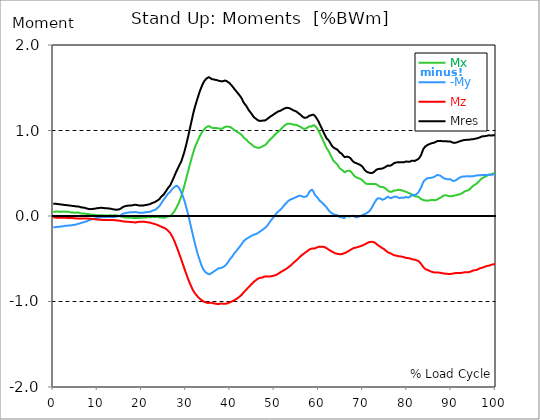
| Category |  Mx |  -My |  Mz |  Mres |
|---|---|---|---|---|
| 0.0 | 0.049 | -0.132 | -0.019 | 0.142 |
| 0.167348456675344 | 0.049 | -0.132 | -0.018 | 0.142 |
| 0.334696913350688 | 0.049 | -0.132 | -0.018 | 0.142 |
| 0.5020453700260321 | 0.052 | -0.13 | -0.019 | 0.142 |
| 0.669393826701376 | 0.053 | -0.129 | -0.019 | 0.142 |
| 0.83674228337672 | 0.054 | -0.128 | -0.019 | 0.141 |
| 1.0040907400520642 | 0.053 | -0.126 | -0.019 | 0.139 |
| 1.1621420602454444 | 0.05 | -0.128 | -0.019 | 0.139 |
| 1.3294905169207885 | 0.049 | -0.126 | -0.021 | 0.138 |
| 1.4968389735961325 | 0.048 | -0.125 | -0.021 | 0.137 |
| 1.6641874302714765 | 0.049 | -0.124 | -0.021 | 0.135 |
| 1.8315358869468206 | 0.05 | -0.123 | -0.021 | 0.134 |
| 1.9988843436221646 | 0.052 | -0.12 | -0.021 | 0.133 |
| 2.1662328002975086 | 0.052 | -0.119 | -0.021 | 0.132 |
| 2.333581256972853 | 0.05 | -0.119 | -0.021 | 0.13 |
| 2.5009297136481967 | 0.049 | -0.117 | -0.021 | 0.129 |
| 2.6682781703235405 | 0.052 | -0.115 | -0.021 | 0.129 |
| 2.8356266269988843 | 0.052 | -0.115 | -0.022 | 0.128 |
| 3.002975083674229 | 0.049 | -0.115 | -0.022 | 0.126 |
| 3.1703235403495724 | 0.048 | -0.114 | -0.022 | 0.126 |
| 3.337671997024917 | 0.049 | -0.112 | -0.022 | 0.125 |
| 3.4957233172182973 | 0.049 | -0.111 | -0.022 | 0.124 |
| 3.663071773893641 | 0.048 | -0.11 | -0.023 | 0.123 |
| 3.8304202305689854 | 0.044 | -0.11 | -0.025 | 0.121 |
| 3.997768687244329 | 0.04 | -0.11 | -0.025 | 0.12 |
| 4.165117143919673 | 0.041 | -0.107 | -0.025 | 0.119 |
| 4.332465600595017 | 0.043 | -0.106 | -0.025 | 0.117 |
| 4.499814057270361 | 0.043 | -0.105 | -0.026 | 0.116 |
| 4.667162513945706 | 0.04 | -0.103 | -0.026 | 0.116 |
| 4.834510970621049 | 0.039 | -0.103 | -0.027 | 0.115 |
| 5.001859427296393 | 0.037 | -0.102 | -0.027 | 0.114 |
| 5.169207883971737 | 0.037 | -0.099 | -0.027 | 0.112 |
| 5.336556340647081 | 0.041 | -0.095 | -0.028 | 0.111 |
| 5.503904797322425 | 0.04 | -0.093 | -0.03 | 0.11 |
| 5.671253253997769 | 0.04 | -0.09 | -0.03 | 0.111 |
| 5.82930457419115 | 0.037 | -0.089 | -0.031 | 0.11 |
| 5.996653030866494 | 0.034 | -0.086 | -0.031 | 0.106 |
| 6.164001487541838 | 0.031 | -0.083 | -0.03 | 0.103 |
| 6.331349944217181 | 0.028 | -0.08 | -0.03 | 0.101 |
| 6.498698400892526 | 0.028 | -0.076 | -0.03 | 0.099 |
| 6.66604685756787 | 0.028 | -0.075 | -0.03 | 0.099 |
| 6.833395314243213 | 0.028 | -0.074 | -0.03 | 0.099 |
| 7.000743770918558 | 0.028 | -0.071 | -0.03 | 0.097 |
| 7.168092227593902 | 0.028 | -0.068 | -0.03 | 0.094 |
| 7.335440684269246 | 0.026 | -0.066 | -0.03 | 0.092 |
| 7.50278914094459 | 0.025 | -0.062 | -0.03 | 0.089 |
| 7.6701375976199335 | 0.023 | -0.059 | -0.03 | 0.086 |
| 7.837486054295278 | 0.022 | -0.055 | -0.031 | 0.084 |
| 7.995537374488658 | 0.022 | -0.05 | -0.031 | 0.081 |
| 8.162885831164003 | 0.021 | -0.046 | -0.031 | 0.08 |
| 8.330234287839346 | 0.018 | -0.044 | -0.031 | 0.08 |
| 8.49758274451469 | 0.015 | -0.041 | -0.032 | 0.08 |
| 8.664931201190035 | 0.015 | -0.039 | -0.034 | 0.081 |
| 8.832279657865378 | 0.015 | -0.035 | -0.034 | 0.083 |
| 8.999628114540721 | 0.015 | -0.034 | -0.035 | 0.084 |
| 9.166976571216066 | 0.015 | -0.031 | -0.036 | 0.085 |
| 9.334325027891412 | 0.014 | -0.03 | -0.037 | 0.085 |
| 9.501673484566755 | 0.012 | -0.027 | -0.037 | 0.086 |
| 9.669021941242098 | 0.008 | -0.026 | -0.039 | 0.089 |
| 9.836370397917442 | 0.01 | -0.022 | -0.04 | 0.09 |
| 10.003718854592787 | 0.01 | -0.021 | -0.041 | 0.092 |
| 10.17106731126813 | 0.01 | -0.019 | -0.041 | 0.092 |
| 10.329118631461512 | 0.009 | -0.019 | -0.043 | 0.093 |
| 10.496467088136853 | 0.009 | -0.018 | -0.044 | 0.094 |
| 10.663815544812199 | 0.008 | -0.015 | -0.044 | 0.095 |
| 10.831164001487544 | 0.009 | -0.014 | -0.045 | 0.097 |
| 10.998512458162887 | 0.009 | -0.013 | -0.046 | 0.095 |
| 11.16586091483823 | 0.009 | -0.013 | -0.046 | 0.094 |
| 11.333209371513574 | 0.008 | -0.014 | -0.046 | 0.093 |
| 11.50055782818892 | 0.006 | -0.014 | -0.046 | 0.092 |
| 11.667906284864264 | 0.005 | -0.014 | -0.046 | 0.092 |
| 11.835254741539607 | 0.004 | -0.013 | -0.046 | 0.092 |
| 12.00260319821495 | 0.005 | -0.012 | -0.046 | 0.09 |
| 12.169951654890292 | 0.006 | -0.01 | -0.048 | 0.09 |
| 12.337300111565641 | 0.005 | -0.012 | -0.048 | 0.089 |
| 12.504648568240984 | 0.006 | -0.012 | -0.046 | 0.089 |
| 12.662699888434362 | 0.008 | -0.012 | -0.046 | 0.088 |
| 12.830048345109708 | 0.009 | -0.01 | -0.048 | 0.086 |
| 12.997396801785053 | 0.009 | -0.012 | -0.048 | 0.085 |
| 13.164745258460396 | 0.005 | -0.012 | -0.048 | 0.083 |
| 13.33209371513574 | 0.004 | -0.012 | -0.048 | 0.08 |
| 13.499442171811083 | 0.006 | -0.013 | -0.048 | 0.079 |
| 13.666790628486426 | 0.009 | -0.012 | -0.048 | 0.077 |
| 13.834139085161771 | 0.01 | -0.01 | -0.049 | 0.076 |
| 14.001487541837117 | 0.008 | -0.01 | -0.05 | 0.075 |
| 14.16883599851246 | 0.005 | -0.009 | -0.05 | 0.074 |
| 14.336184455187803 | 0.004 | -0.006 | -0.052 | 0.074 |
| 14.503532911863147 | 0.004 | -0.004 | -0.052 | 0.075 |
| 14.670881368538492 | 0.005 | -0.004 | -0.053 | 0.076 |
| 14.828932688731873 | 0.001 | -0.001 | -0.054 | 0.077 |
| 14.996281145407215 | -0.001 | 0.001 | -0.055 | 0.08 |
| 15.163629602082558 | -0.004 | 0.005 | -0.057 | 0.085 |
| 15.330978058757903 | -0.008 | 0.012 | -0.058 | 0.09 |
| 15.498326515433247 | -0.008 | 0.015 | -0.059 | 0.094 |
| 15.665674972108594 | -0.01 | 0.025 | -0.062 | 0.103 |
| 15.833023428783937 | -0.014 | 0.028 | -0.063 | 0.108 |
| 16.00037188545928 | -0.017 | 0.03 | -0.065 | 0.111 |
| 16.167720342134626 | -0.017 | 0.032 | -0.065 | 0.114 |
| 16.335068798809967 | -0.017 | 0.035 | -0.066 | 0.116 |
| 16.502417255485312 | -0.018 | 0.036 | -0.067 | 0.117 |
| 16.669765712160658 | -0.018 | 0.039 | -0.067 | 0.12 |
| 16.837114168836 | -0.018 | 0.04 | -0.068 | 0.12 |
| 17.004462625511344 | -0.021 | 0.04 | -0.068 | 0.121 |
| 17.16251394570472 | -0.021 | 0.043 | -0.068 | 0.123 |
| 17.32986240238007 | -0.018 | 0.044 | -0.07 | 0.124 |
| 17.497210859055414 | -0.019 | 0.044 | -0.071 | 0.124 |
| 17.664559315730756 | -0.021 | 0.043 | -0.071 | 0.124 |
| 17.8319077724061 | -0.022 | 0.043 | -0.071 | 0.125 |
| 17.999256229081443 | -0.022 | 0.044 | -0.072 | 0.126 |
| 18.166604685756788 | -0.021 | 0.045 | -0.074 | 0.128 |
| 18.333953142432133 | -0.022 | 0.046 | -0.075 | 0.13 |
| 18.501301599107478 | -0.022 | 0.048 | -0.076 | 0.132 |
| 18.668650055782823 | -0.022 | 0.046 | -0.075 | 0.13 |
| 18.835998512458165 | -0.022 | 0.044 | -0.074 | 0.129 |
| 19.00334696913351 | -0.022 | 0.043 | -0.071 | 0.128 |
| 19.170695425808855 | -0.021 | 0.04 | -0.07 | 0.125 |
| 19.338043882484197 | -0.022 | 0.037 | -0.067 | 0.123 |
| 19.496095202677576 | -0.021 | 0.037 | -0.067 | 0.123 |
| 19.66344365935292 | -0.019 | 0.037 | -0.067 | 0.121 |
| 19.830792116028263 | -0.021 | 0.037 | -0.066 | 0.121 |
| 19.998140572703612 | -0.019 | 0.037 | -0.066 | 0.123 |
| 20.165489029378953 | -0.018 | 0.037 | -0.066 | 0.123 |
| 20.3328374860543 | -0.017 | 0.039 | -0.066 | 0.123 |
| 20.500185942729644 | -0.017 | 0.041 | -0.067 | 0.124 |
| 20.667534399404985 | -0.018 | 0.043 | -0.068 | 0.126 |
| 20.83488285608033 | -0.021 | 0.043 | -0.07 | 0.126 |
| 21.002231312755672 | -0.018 | 0.044 | -0.071 | 0.129 |
| 21.16957976943102 | -0.015 | 0.045 | -0.072 | 0.132 |
| 21.336928226106362 | -0.014 | 0.046 | -0.074 | 0.133 |
| 21.504276682781704 | -0.013 | 0.046 | -0.075 | 0.135 |
| 21.67162513945705 | -0.012 | 0.048 | -0.076 | 0.137 |
| 21.82967645965043 | -0.014 | 0.049 | -0.079 | 0.139 |
| 21.997024916325774 | -0.015 | 0.052 | -0.08 | 0.142 |
| 22.16437337300112 | -0.015 | 0.057 | -0.083 | 0.147 |
| 22.33172182967646 | -0.013 | 0.061 | -0.085 | 0.151 |
| 22.499070286351806 | -0.012 | 0.065 | -0.088 | 0.155 |
| 22.666418743027148 | -0.013 | 0.067 | -0.09 | 0.157 |
| 22.833767199702496 | -0.013 | 0.07 | -0.093 | 0.161 |
| 23.00111565637784 | -0.013 | 0.072 | -0.095 | 0.164 |
| 23.168464113053183 | -0.014 | 0.077 | -0.098 | 0.17 |
| 23.335812569728528 | -0.013 | 0.084 | -0.101 | 0.175 |
| 23.50316102640387 | -0.013 | 0.09 | -0.105 | 0.181 |
| 23.670509483079215 | -0.013 | 0.099 | -0.108 | 0.186 |
| 23.83785793975456 | -0.014 | 0.105 | -0.111 | 0.19 |
| 23.995909259947936 | -0.017 | 0.116 | -0.115 | 0.199 |
| 24.163257716623285 | -0.017 | 0.129 | -0.119 | 0.209 |
| 24.330606173298627 | -0.017 | 0.145 | -0.124 | 0.223 |
| 24.49795462997397 | -0.015 | 0.156 | -0.128 | 0.231 |
| 24.665303086649313 | -0.017 | 0.169 | -0.13 | 0.237 |
| 24.83265154332466 | -0.019 | 0.182 | -0.134 | 0.248 |
| 25.0 | -0.021 | 0.192 | -0.138 | 0.255 |
| 25.167348456675345 | -0.021 | 0.206 | -0.143 | 0.268 |
| 25.334696913350694 | -0.017 | 0.218 | -0.147 | 0.279 |
| 25.502045370026035 | -0.013 | 0.231 | -0.152 | 0.293 |
| 25.669393826701377 | -0.009 | 0.244 | -0.159 | 0.307 |
| 25.836742283376722 | -0.008 | 0.254 | -0.166 | 0.319 |
| 26.004090740052067 | -0.005 | 0.265 | -0.175 | 0.333 |
| 26.17143919672741 | -0.004 | 0.272 | -0.185 | 0.343 |
| 26.329490516920792 | -0.001 | 0.277 | -0.194 | 0.352 |
| 26.49683897359613 | 0.004 | 0.288 | -0.206 | 0.368 |
| 26.66418743027148 | 0.012 | 0.301 | -0.221 | 0.386 |
| 26.831535886946828 | 0.019 | 0.312 | -0.236 | 0.404 |
| 26.998884343622166 | 0.03 | 0.323 | -0.253 | 0.425 |
| 27.166232800297514 | 0.04 | 0.333 | -0.271 | 0.444 |
| 27.333581256972852 | 0.053 | 0.338 | -0.289 | 0.463 |
| 27.5009297136482 | 0.067 | 0.346 | -0.31 | 0.484 |
| 27.668278170323543 | 0.083 | 0.35 | -0.333 | 0.505 |
| 27.835626626998888 | 0.098 | 0.351 | -0.355 | 0.523 |
| 28.002975083674233 | 0.115 | 0.35 | -0.377 | 0.541 |
| 28.170323540349575 | 0.132 | 0.342 | -0.401 | 0.56 |
| 28.33767199702492 | 0.151 | 0.334 | -0.425 | 0.578 |
| 28.50502045370026 | 0.173 | 0.321 | -0.449 | 0.596 |
| 28.663071773893645 | 0.195 | 0.306 | -0.472 | 0.613 |
| 28.830420230568986 | 0.218 | 0.285 | -0.495 | 0.628 |
| 28.99776868724433 | 0.244 | 0.263 | -0.52 | 0.649 |
| 29.165117143919673 | 0.272 | 0.246 | -0.546 | 0.677 |
| 29.33246560059502 | 0.303 | 0.225 | -0.572 | 0.703 |
| 29.499814057270367 | 0.333 | 0.199 | -0.595 | 0.73 |
| 29.66716251394571 | 0.364 | 0.174 | -0.621 | 0.76 |
| 29.834510970621054 | 0.399 | 0.145 | -0.646 | 0.794 |
| 30.00185942729639 | 0.431 | 0.11 | -0.67 | 0.826 |
| 30.169207883971744 | 0.465 | 0.079 | -0.693 | 0.862 |
| 30.33655634064708 | 0.498 | 0.046 | -0.717 | 0.899 |
| 30.50390479732243 | 0.53 | 0.012 | -0.741 | 0.935 |
| 30.671253253997772 | 0.563 | -0.023 | -0.763 | 0.974 |
| 30.829304574191156 | 0.595 | -0.062 | -0.783 | 1.014 |
| 30.996653030866494 | 0.627 | -0.101 | -0.804 | 1.054 |
| 31.164001487541842 | 0.658 | -0.138 | -0.823 | 1.093 |
| 31.331349944217187 | 0.69 | -0.175 | -0.843 | 1.132 |
| 31.498698400892525 | 0.72 | -0.213 | -0.861 | 1.17 |
| 31.666046857567874 | 0.748 | -0.249 | -0.876 | 1.208 |
| 31.833395314243212 | 0.775 | -0.284 | -0.89 | 1.241 |
| 32.00074377091856 | 0.801 | -0.32 | -0.903 | 1.274 |
| 32.1680922275939 | 0.825 | -0.355 | -0.915 | 1.303 |
| 32.33544068426925 | 0.845 | -0.387 | -0.925 | 1.332 |
| 32.50278914094459 | 0.863 | -0.419 | -0.935 | 1.36 |
| 32.670137597619934 | 0.884 | -0.449 | -0.945 | 1.387 |
| 32.83748605429528 | 0.903 | -0.477 | -0.954 | 1.414 |
| 33.004834510970625 | 0.923 | -0.503 | -0.963 | 1.44 |
| 33.162885831164004 | 0.941 | -0.529 | -0.97 | 1.466 |
| 33.33023428783935 | 0.956 | -0.555 | -0.977 | 1.489 |
| 33.497582744514695 | 0.972 | -0.577 | -0.983 | 1.511 |
| 33.664931201190036 | 0.986 | -0.596 | -0.99 | 1.532 |
| 33.83227965786538 | 0.997 | -0.614 | -0.996 | 1.55 |
| 33.99962811454073 | 1.009 | -0.63 | -1.001 | 1.566 |
| 34.16697657121607 | 1.019 | -0.641 | -1.004 | 1.579 |
| 34.33432502789141 | 1.027 | -0.654 | -1.008 | 1.591 |
| 34.50167348456676 | 1.035 | -0.663 | -1.01 | 1.601 |
| 34.6690219412421 | 1.04 | -0.667 | -1.013 | 1.608 |
| 34.83637039791744 | 1.046 | -0.671 | -1.017 | 1.615 |
| 35.00371885459279 | 1.05 | -0.677 | -1.018 | 1.621 |
| 35.17106731126814 | 1.052 | -0.68 | -1.018 | 1.623 |
| 35.338415767943474 | 1.049 | -0.683 | -1.014 | 1.621 |
| 35.49646708813686 | 1.043 | -0.677 | -1.013 | 1.613 |
| 35.6638155448122 | 1.036 | -0.67 | -1.014 | 1.605 |
| 35.831164001487544 | 1.03 | -0.661 | -1.018 | 1.6 |
| 35.998512458162885 | 1.03 | -0.661 | -1.019 | 1.601 |
| 36.165860914838234 | 1.028 | -0.655 | -1.021 | 1.599 |
| 36.333209371513576 | 1.03 | -0.646 | -1.022 | 1.596 |
| 36.50055782818892 | 1.03 | -0.64 | -1.023 | 1.594 |
| 36.667906284864266 | 1.03 | -0.636 | -1.026 | 1.594 |
| 36.83525474153961 | 1.028 | -0.631 | -1.027 | 1.591 |
| 37.002603198214956 | 1.027 | -0.625 | -1.028 | 1.588 |
| 37.1699516548903 | 1.026 | -0.617 | -1.031 | 1.586 |
| 37.337300111565646 | 1.023 | -0.612 | -1.031 | 1.582 |
| 37.50464856824098 | 1.021 | -0.612 | -1.028 | 1.581 |
| 37.66269988843437 | 1.022 | -0.61 | -1.026 | 1.579 |
| 37.83004834510971 | 1.021 | -0.609 | -1.025 | 1.577 |
| 37.99739680178505 | 1.019 | -0.605 | -1.023 | 1.574 |
| 38.16474525846039 | 1.022 | -0.603 | -1.025 | 1.574 |
| 38.33209371513574 | 1.027 | -0.6 | -1.026 | 1.577 |
| 38.49944217181109 | 1.032 | -0.594 | -1.026 | 1.579 |
| 38.666790628486424 | 1.039 | -0.587 | -1.027 | 1.583 |
| 38.83413908516178 | 1.043 | -0.581 | -1.027 | 1.585 |
| 39.001487541837115 | 1.044 | -0.573 | -1.026 | 1.581 |
| 39.16883599851246 | 1.046 | -0.563 | -1.025 | 1.578 |
| 39.336184455187805 | 1.046 | -0.551 | -1.022 | 1.573 |
| 39.503532911863154 | 1.044 | -0.539 | -1.019 | 1.566 |
| 39.670881368538495 | 1.044 | -0.526 | -1.015 | 1.56 |
| 39.83822982521384 | 1.044 | -0.512 | -1.012 | 1.554 |
| 39.996281145407224 | 1.04 | -0.499 | -1.008 | 1.543 |
| 40.163629602082565 | 1.035 | -0.49 | -1.004 | 1.535 |
| 40.33097805875791 | 1.03 | -0.481 | -1 | 1.528 |
| 40.498326515433256 | 1.021 | -0.47 | -0.997 | 1.515 |
| 40.6656749721086 | 1.015 | -0.457 | -0.992 | 1.505 |
| 40.83302342878393 | 1.009 | -0.444 | -0.987 | 1.493 |
| 41.00037188545929 | 1.003 | -0.431 | -0.982 | 1.48 |
| 41.16772034213463 | 0.997 | -0.421 | -0.978 | 1.471 |
| 41.33506879880997 | 0.991 | -0.412 | -0.972 | 1.461 |
| 41.50241725548531 | 0.986 | -0.401 | -0.965 | 1.45 |
| 41.66976571216066 | 0.979 | -0.388 | -0.96 | 1.439 |
| 41.837114168836 | 0.973 | -0.379 | -0.954 | 1.428 |
| 42.004462625511344 | 0.97 | -0.368 | -0.947 | 1.418 |
| 42.17181108218669 | 0.964 | -0.357 | -0.939 | 1.406 |
| 42.32986240238007 | 0.959 | -0.346 | -0.933 | 1.395 |
| 42.497210859055414 | 0.951 | -0.334 | -0.925 | 1.382 |
| 42.66455931573076 | 0.942 | -0.323 | -0.916 | 1.366 |
| 42.831907772406105 | 0.93 | -0.308 | -0.906 | 1.347 |
| 42.999256229081446 | 0.92 | -0.295 | -0.895 | 1.33 |
| 43.16660468575679 | 0.912 | -0.286 | -0.885 | 1.316 |
| 43.33395314243214 | 0.905 | -0.28 | -0.876 | 1.305 |
| 43.50130159910748 | 0.898 | -0.275 | -0.868 | 1.295 |
| 43.66865005578282 | 0.892 | -0.267 | -0.859 | 1.283 |
| 43.83599851245817 | 0.881 | -0.263 | -0.849 | 1.268 |
| 44.00334696913351 | 0.871 | -0.257 | -0.839 | 1.253 |
| 44.17069542580886 | 0.863 | -0.252 | -0.83 | 1.24 |
| 44.3380438824842 | 0.855 | -0.246 | -0.822 | 1.228 |
| 44.49609520267758 | 0.85 | -0.241 | -0.813 | 1.217 |
| 44.66344365935292 | 0.844 | -0.236 | -0.804 | 1.206 |
| 44.83079211602827 | 0.837 | -0.23 | -0.796 | 1.195 |
| 44.99814057270361 | 0.828 | -0.226 | -0.787 | 1.181 |
| 45.16548902937895 | 0.819 | -0.223 | -0.777 | 1.168 |
| 45.332837486054295 | 0.813 | -0.219 | -0.769 | 1.157 |
| 45.500185942729644 | 0.808 | -0.215 | -0.763 | 1.148 |
| 45.66753439940499 | 0.806 | -0.213 | -0.756 | 1.143 |
| 45.83488285608033 | 0.804 | -0.21 | -0.748 | 1.137 |
| 46.00223131275568 | 0.801 | -0.206 | -0.743 | 1.13 |
| 46.16957976943102 | 0.797 | -0.201 | -0.737 | 1.123 |
| 46.336928226106366 | 0.796 | -0.196 | -0.732 | 1.117 |
| 46.50427668278171 | 0.796 | -0.19 | -0.728 | 1.114 |
| 46.671625139457056 | 0.799 | -0.183 | -0.724 | 1.112 |
| 46.829676459650436 | 0.803 | -0.178 | -0.723 | 1.112 |
| 46.99702491632577 | 0.806 | -0.172 | -0.721 | 1.114 |
| 47.16437337300112 | 0.812 | -0.166 | -0.72 | 1.115 |
| 47.33172182967646 | 0.817 | -0.161 | -0.717 | 1.116 |
| 47.49907028635181 | 0.821 | -0.154 | -0.715 | 1.116 |
| 47.66641874302716 | 0.825 | -0.146 | -0.71 | 1.116 |
| 47.83376719970249 | 0.828 | -0.141 | -0.707 | 1.117 |
| 48.001115656377834 | 0.834 | -0.133 | -0.706 | 1.12 |
| 48.16846411305319 | 0.844 | -0.125 | -0.706 | 1.126 |
| 48.33581256972853 | 0.854 | -0.116 | -0.707 | 1.133 |
| 48.50316102640387 | 0.866 | -0.103 | -0.708 | 1.141 |
| 48.67050948307921 | 0.876 | -0.09 | -0.708 | 1.147 |
| 48.837857939754564 | 0.885 | -0.077 | -0.707 | 1.154 |
| 49.005206396429905 | 0.894 | -0.065 | -0.707 | 1.159 |
| 49.163257716623285 | 0.903 | -0.053 | -0.706 | 1.166 |
| 49.33060617329863 | 0.911 | -0.044 | -0.703 | 1.172 |
| 49.49795462997397 | 0.919 | -0.034 | -0.702 | 1.177 |
| 49.66530308664932 | 0.928 | -0.022 | -0.699 | 1.183 |
| 49.832651543324666 | 0.937 | -0.012 | -0.697 | 1.19 |
| 50.0 | 0.946 | 0 | -0.695 | 1.195 |
| 50.16734845667534 | 0.955 | 0.012 | -0.693 | 1.201 |
| 50.33469691335069 | 0.964 | 0.023 | -0.69 | 1.208 |
| 50.50204537002604 | 0.97 | 0.035 | -0.686 | 1.212 |
| 50.66939382670139 | 0.978 | 0.044 | -0.681 | 1.218 |
| 50.836742283376715 | 0.986 | 0.053 | -0.676 | 1.223 |
| 51.00409074005207 | 0.994 | 0.061 | -0.67 | 1.225 |
| 51.17143919672741 | 1 | 0.067 | -0.663 | 1.227 |
| 51.32949051692079 | 1.008 | 0.074 | -0.658 | 1.231 |
| 51.496838973596134 | 1.018 | 0.081 | -0.653 | 1.236 |
| 51.66418743027148 | 1.027 | 0.092 | -0.648 | 1.241 |
| 51.831535886946824 | 1.036 | 0.101 | -0.644 | 1.246 |
| 51.99888434362217 | 1.045 | 0.112 | -0.639 | 1.252 |
| 52.16623280029752 | 1.053 | 0.124 | -0.634 | 1.255 |
| 52.33358125697285 | 1.061 | 0.134 | -0.628 | 1.259 |
| 52.5009297136482 | 1.067 | 0.143 | -0.622 | 1.262 |
| 52.668278170323546 | 1.072 | 0.151 | -0.617 | 1.265 |
| 52.835626626998895 | 1.076 | 0.161 | -0.61 | 1.266 |
| 53.00297508367424 | 1.079 | 0.17 | -0.605 | 1.265 |
| 53.17032354034958 | 1.079 | 0.177 | -0.599 | 1.263 |
| 53.33767199702492 | 1.08 | 0.183 | -0.592 | 1.261 |
| 53.50502045370027 | 1.079 | 0.19 | -0.586 | 1.258 |
| 53.663071773893655 | 1.077 | 0.195 | -0.578 | 1.254 |
| 53.83042023056899 | 1.076 | 0.199 | -0.57 | 1.249 |
| 53.99776868724433 | 1.072 | 0.2 | -0.563 | 1.244 |
| 54.16511714391967 | 1.071 | 0.204 | -0.555 | 1.239 |
| 54.33246560059503 | 1.068 | 0.206 | -0.546 | 1.235 |
| 54.49981405727037 | 1.068 | 0.213 | -0.538 | 1.231 |
| 54.667162513945705 | 1.068 | 0.215 | -0.53 | 1.227 |
| 54.834510970621054 | 1.068 | 0.221 | -0.524 | 1.225 |
| 55.0018594272964 | 1.066 | 0.223 | -0.516 | 1.219 |
| 55.169207883971744 | 1.061 | 0.227 | -0.507 | 1.213 |
| 55.336556340647086 | 1.054 | 0.232 | -0.498 | 1.205 |
| 55.50390479732243 | 1.052 | 0.235 | -0.49 | 1.199 |
| 55.671253253997776 | 1.048 | 0.237 | -0.483 | 1.192 |
| 55.83860171067312 | 1.044 | 0.237 | -0.474 | 1.186 |
| 55.9966530308665 | 1.04 | 0.235 | -0.466 | 1.179 |
| 56.16400148754184 | 1.032 | 0.232 | -0.458 | 1.17 |
| 56.33134994421718 | 1.026 | 0.227 | -0.452 | 1.16 |
| 56.498698400892536 | 1.022 | 0.225 | -0.444 | 1.155 |
| 56.66604685756788 | 1.019 | 0.223 | -0.439 | 1.151 |
| 56.83339531424321 | 1.019 | 0.225 | -0.432 | 1.148 |
| 57.00074377091856 | 1.022 | 0.225 | -0.426 | 1.15 |
| 57.16809222759391 | 1.026 | 0.226 | -0.421 | 1.151 |
| 57.33544068426925 | 1.03 | 0.232 | -0.414 | 1.152 |
| 57.5027891409446 | 1.035 | 0.244 | -0.408 | 1.156 |
| 57.670137597619934 | 1.043 | 0.262 | -0.401 | 1.164 |
| 57.83748605429528 | 1.05 | 0.279 | -0.396 | 1.173 |
| 58.004834510970625 | 1.048 | 0.289 | -0.39 | 1.173 |
| 58.16288583116401 | 1.049 | 0.299 | -0.386 | 1.175 |
| 58.330234287839346 | 1.045 | 0.305 | -0.382 | 1.173 |
| 58.497582744514695 | 1.055 | 0.307 | -0.382 | 1.183 |
| 58.66493120119004 | 1.059 | 0.299 | -0.379 | 1.186 |
| 58.832279657865385 | 1.063 | 0.284 | -0.378 | 1.183 |
| 58.999628114540734 | 1.061 | 0.263 | -0.379 | 1.178 |
| 59.16697657121607 | 1.054 | 0.245 | -0.378 | 1.169 |
| 59.33432502789142 | 1.045 | 0.237 | -0.374 | 1.157 |
| 59.50167348456676 | 1.035 | 0.227 | -0.37 | 1.145 |
| 59.66902194124211 | 1.022 | 0.217 | -0.366 | 1.13 |
| 59.83637039791745 | 1.009 | 0.208 | -0.361 | 1.116 |
| 60.00371885459278 | 0.994 | 0.196 | -0.36 | 1.099 |
| 60.17106731126813 | 0.975 | 0.183 | -0.36 | 1.081 |
| 60.33841576794349 | 0.956 | 0.174 | -0.359 | 1.062 |
| 60.49646708813685 | 0.938 | 0.166 | -0.357 | 1.044 |
| 60.6638155448122 | 0.92 | 0.159 | -0.359 | 1.027 |
| 60.831164001487544 | 0.902 | 0.152 | -0.359 | 1.009 |
| 60.99851245816289 | 0.883 | 0.143 | -0.36 | 0.99 |
| 61.16586091483824 | 0.863 | 0.134 | -0.361 | 0.972 |
| 61.333209371513576 | 0.844 | 0.126 | -0.365 | 0.954 |
| 61.50055782818892 | 0.825 | 0.117 | -0.369 | 0.937 |
| 61.667906284864266 | 0.804 | 0.107 | -0.373 | 0.917 |
| 61.835254741539615 | 0.788 | 0.097 | -0.378 | 0.905 |
| 62.002603198214956 | 0.777 | 0.084 | -0.385 | 0.898 |
| 62.16995165489029 | 0.765 | 0.071 | -0.392 | 0.89 |
| 62.33730011156564 | 0.75 | 0.063 | -0.396 | 0.877 |
| 62.504648568240995 | 0.732 | 0.052 | -0.403 | 0.865 |
| 62.67199702491633 | 0.712 | 0.044 | -0.406 | 0.849 |
| 62.83004834510971 | 0.694 | 0.036 | -0.412 | 0.834 |
| 62.99739680178505 | 0.677 | 0.031 | -0.417 | 0.822 |
| 63.1647452584604 | 0.661 | 0.026 | -0.421 | 0.809 |
| 63.33209371513575 | 0.646 | 0.022 | -0.426 | 0.801 |
| 63.4994421718111 | 0.637 | 0.018 | -0.43 | 0.796 |
| 63.666790628486424 | 0.628 | 0.014 | -0.435 | 0.79 |
| 63.83413908516177 | 0.621 | 0.013 | -0.437 | 0.786 |
| 64.00148754183712 | 0.613 | 0.012 | -0.44 | 0.782 |
| 64.16883599851248 | 0.605 | 0.01 | -0.441 | 0.778 |
| 64.3361844551878 | 0.594 | 0.005 | -0.444 | 0.77 |
| 64.50353291186315 | 0.577 | -0.003 | -0.445 | 0.759 |
| 64.6708813685385 | 0.563 | -0.009 | -0.446 | 0.747 |
| 64.83822982521384 | 0.552 | -0.014 | -0.448 | 0.739 |
| 65.00557828188919 | 0.546 | -0.014 | -0.446 | 0.733 |
| 65.16362960208257 | 0.546 | -0.01 | -0.446 | 0.73 |
| 65.3309780587579 | 0.538 | -0.013 | -0.444 | 0.721 |
| 65.49832651543326 | 0.528 | -0.022 | -0.44 | 0.708 |
| 65.6656749721086 | 0.519 | -0.027 | -0.437 | 0.697 |
| 65.83302342878395 | 0.512 | -0.025 | -0.434 | 0.689 |
| 66.00037188545929 | 0.512 | -0.013 | -0.432 | 0.688 |
| 66.16772034213463 | 0.52 | 0.001 | -0.427 | 0.692 |
| 66.33506879880998 | 0.526 | 0.005 | -0.422 | 0.694 |
| 66.50241725548531 | 0.532 | 0 | -0.417 | 0.694 |
| 66.66976571216065 | 0.528 | -0.003 | -0.413 | 0.689 |
| 66.83711416883601 | 0.53 | -0.008 | -0.408 | 0.688 |
| 67.00446262551135 | 0.529 | -0.006 | -0.403 | 0.684 |
| 67.1718110821867 | 0.524 | -0.003 | -0.397 | 0.676 |
| 67.32986240238007 | 0.515 | 0.001 | -0.391 | 0.666 |
| 67.49721085905541 | 0.505 | 0.003 | -0.385 | 0.654 |
| 67.66455931573076 | 0.494 | 0.004 | -0.381 | 0.644 |
| 67.83190777240611 | 0.483 | 0.003 | -0.377 | 0.635 |
| 67.99925622908145 | 0.472 | -0.003 | -0.374 | 0.628 |
| 68.16660468575678 | 0.465 | -0.009 | -0.372 | 0.623 |
| 68.33395314243214 | 0.457 | -0.014 | -0.37 | 0.621 |
| 68.50130159910749 | 0.452 | -0.017 | -0.368 | 0.618 |
| 68.66865005578282 | 0.448 | -0.015 | -0.365 | 0.614 |
| 68.83599851245816 | 0.444 | -0.012 | -0.363 | 0.61 |
| 69.00334696913352 | 0.441 | -0.008 | -0.36 | 0.606 |
| 69.17069542580886 | 0.439 | -0.005 | -0.357 | 0.603 |
| 69.3380438824842 | 0.436 | -0.003 | -0.355 | 0.6 |
| 69.50539233915956 | 0.431 | 0 | -0.352 | 0.594 |
| 69.66344365935292 | 0.426 | 0.005 | -0.35 | 0.586 |
| 69.83079211602826 | 0.421 | 0.01 | -0.346 | 0.579 |
| 69.99814057270362 | 0.412 | 0.013 | -0.342 | 0.568 |
| 70.16548902937896 | 0.403 | 0.017 | -0.338 | 0.556 |
| 70.33283748605429 | 0.392 | 0.019 | -0.333 | 0.542 |
| 70.50018594272964 | 0.386 | 0.025 | -0.329 | 0.533 |
| 70.667534399405 | 0.379 | 0.027 | -0.325 | 0.525 |
| 70.83488285608033 | 0.377 | 0.034 | -0.319 | 0.517 |
| 71.00223131275568 | 0.374 | 0.04 | -0.315 | 0.514 |
| 71.16957976943102 | 0.374 | 0.046 | -0.311 | 0.511 |
| 71.33692822610637 | 0.374 | 0.053 | -0.307 | 0.508 |
| 71.50427668278171 | 0.374 | 0.059 | -0.306 | 0.506 |
| 71.67162513945706 | 0.374 | 0.07 | -0.303 | 0.503 |
| 71.8389735961324 | 0.374 | 0.083 | -0.302 | 0.501 |
| 71.99702491632577 | 0.373 | 0.098 | -0.302 | 0.502 |
| 72.16437337300113 | 0.373 | 0.112 | -0.303 | 0.503 |
| 72.33172182967647 | 0.373 | 0.129 | -0.305 | 0.51 |
| 72.49907028635181 | 0.374 | 0.146 | -0.307 | 0.516 |
| 72.66641874302715 | 0.375 | 0.16 | -0.311 | 0.523 |
| 72.8337671997025 | 0.374 | 0.174 | -0.316 | 0.53 |
| 73.00111565637783 | 0.372 | 0.188 | -0.324 | 0.539 |
| 73.16846411305319 | 0.366 | 0.199 | -0.332 | 0.546 |
| 73.33581256972853 | 0.36 | 0.205 | -0.339 | 0.548 |
| 73.50316102640387 | 0.354 | 0.204 | -0.347 | 0.55 |
| 73.67050948307921 | 0.348 | 0.208 | -0.351 | 0.551 |
| 73.83785793975457 | 0.343 | 0.206 | -0.356 | 0.551 |
| 74.00520639642991 | 0.339 | 0.203 | -0.363 | 0.552 |
| 74.16325771662328 | 0.338 | 0.197 | -0.369 | 0.554 |
| 74.33060617329863 | 0.338 | 0.191 | -0.374 | 0.555 |
| 74.49795462997398 | 0.338 | 0.188 | -0.379 | 0.556 |
| 74.66530308664932 | 0.335 | 0.195 | -0.383 | 0.561 |
| 74.83265154332466 | 0.332 | 0.197 | -0.39 | 0.565 |
| 75.00000000000001 | 0.326 | 0.203 | -0.397 | 0.57 |
| 75.16734845667534 | 0.32 | 0.208 | -0.404 | 0.574 |
| 75.3346969133507 | 0.31 | 0.217 | -0.413 | 0.582 |
| 75.50204537002605 | 0.302 | 0.222 | -0.422 | 0.588 |
| 75.66939382670138 | 0.295 | 0.227 | -0.426 | 0.591 |
| 75.83674228337672 | 0.289 | 0.222 | -0.43 | 0.59 |
| 76.00409074005208 | 0.285 | 0.213 | -0.432 | 0.587 |
| 76.17143919672742 | 0.284 | 0.206 | -0.435 | 0.586 |
| 76.33878765340276 | 0.284 | 0.209 | -0.439 | 0.592 |
| 76.49683897359614 | 0.284 | 0.214 | -0.444 | 0.597 |
| 76.66418743027148 | 0.286 | 0.217 | -0.449 | 0.603 |
| 76.83153588694682 | 0.292 | 0.221 | -0.454 | 0.612 |
| 76.99888434362218 | 0.298 | 0.225 | -0.459 | 0.618 |
| 77.16623280029752 | 0.299 | 0.223 | -0.461 | 0.619 |
| 77.33358125697285 | 0.298 | 0.226 | -0.461 | 0.623 |
| 77.5009297136482 | 0.299 | 0.227 | -0.463 | 0.625 |
| 77.66827817032356 | 0.302 | 0.226 | -0.466 | 0.627 |
| 77.83562662699889 | 0.306 | 0.221 | -0.468 | 0.628 |
| 78.00297508367423 | 0.307 | 0.214 | -0.47 | 0.628 |
| 78.17032354034959 | 0.306 | 0.21 | -0.47 | 0.627 |
| 78.33767199702493 | 0.305 | 0.209 | -0.471 | 0.627 |
| 78.50502045370027 | 0.302 | 0.213 | -0.472 | 0.627 |
| 78.67236891037561 | 0.302 | 0.215 | -0.475 | 0.628 |
| 78.83042023056899 | 0.299 | 0.215 | -0.476 | 0.63 |
| 78.99776868724433 | 0.295 | 0.213 | -0.477 | 0.628 |
| 79.16511714391969 | 0.29 | 0.213 | -0.479 | 0.627 |
| 79.33246560059503 | 0.289 | 0.215 | -0.483 | 0.63 |
| 79.49981405727036 | 0.286 | 0.219 | -0.486 | 0.634 |
| 79.66716251394571 | 0.284 | 0.222 | -0.489 | 0.636 |
| 79.83451097062107 | 0.281 | 0.221 | -0.49 | 0.636 |
| 80.00185942729641 | 0.277 | 0.218 | -0.492 | 0.636 |
| 80.16920788397174 | 0.274 | 0.215 | -0.492 | 0.634 |
| 80.33655634064709 | 0.27 | 0.217 | -0.493 | 0.634 |
| 80.50390479732243 | 0.265 | 0.222 | -0.497 | 0.636 |
| 80.67125325399778 | 0.262 | 0.227 | -0.498 | 0.637 |
| 80.83860171067312 | 0.259 | 0.235 | -0.501 | 0.643 |
| 80.99665303086651 | 0.254 | 0.241 | -0.503 | 0.645 |
| 81.16400148754184 | 0.248 | 0.244 | -0.506 | 0.645 |
| 81.3313499442172 | 0.24 | 0.249 | -0.508 | 0.646 |
| 81.49869840089255 | 0.236 | 0.245 | -0.508 | 0.645 |
| 81.66604685756786 | 0.232 | 0.243 | -0.51 | 0.644 |
| 81.83339531424322 | 0.23 | 0.245 | -0.512 | 0.648 |
| 82.00074377091858 | 0.228 | 0.252 | -0.516 | 0.653 |
| 82.16809222759392 | 0.227 | 0.259 | -0.52 | 0.657 |
| 82.33544068426926 | 0.227 | 0.266 | -0.521 | 0.661 |
| 82.50278914094459 | 0.225 | 0.275 | -0.525 | 0.666 |
| 82.67013759761994 | 0.219 | 0.288 | -0.532 | 0.674 |
| 82.83748605429528 | 0.213 | 0.302 | -0.539 | 0.685 |
| 83.00483451097062 | 0.204 | 0.32 | -0.551 | 0.699 |
| 83.17218296764597 | 0.199 | 0.337 | -0.561 | 0.716 |
| 83.33023428783935 | 0.194 | 0.359 | -0.574 | 0.739 |
| 83.4975827445147 | 0.19 | 0.379 | -0.587 | 0.763 |
| 83.66493120119004 | 0.187 | 0.399 | -0.599 | 0.783 |
| 83.83227965786537 | 0.186 | 0.412 | -0.608 | 0.797 |
| 83.99962811454073 | 0.182 | 0.421 | -0.615 | 0.808 |
| 84.16697657121607 | 0.179 | 0.427 | -0.623 | 0.815 |
| 84.33432502789142 | 0.179 | 0.434 | -0.626 | 0.821 |
| 84.50167348456677 | 0.181 | 0.44 | -0.628 | 0.828 |
| 84.6690219412421 | 0.182 | 0.444 | -0.632 | 0.834 |
| 84.83637039791745 | 0.182 | 0.445 | -0.636 | 0.836 |
| 85.0037188545928 | 0.182 | 0.445 | -0.64 | 0.839 |
| 85.17106731126813 | 0.183 | 0.445 | -0.645 | 0.844 |
| 85.33841576794349 | 0.186 | 0.446 | -0.649 | 0.846 |
| 85.50576422461883 | 0.188 | 0.448 | -0.652 | 0.85 |
| 85.66381554481221 | 0.188 | 0.449 | -0.654 | 0.852 |
| 85.83116400148755 | 0.188 | 0.452 | -0.657 | 0.854 |
| 85.99851245816289 | 0.186 | 0.457 | -0.659 | 0.858 |
| 86.16586091483823 | 0.183 | 0.458 | -0.661 | 0.859 |
| 86.33320937151358 | 0.185 | 0.465 | -0.661 | 0.863 |
| 86.50055782818893 | 0.187 | 0.471 | -0.662 | 0.868 |
| 86.66790628486427 | 0.19 | 0.476 | -0.663 | 0.872 |
| 86.83525474153961 | 0.194 | 0.48 | -0.662 | 0.876 |
| 87.00260319821496 | 0.2 | 0.48 | -0.662 | 0.877 |
| 87.16995165489031 | 0.205 | 0.476 | -0.662 | 0.877 |
| 87.33730011156564 | 0.209 | 0.474 | -0.663 | 0.876 |
| 87.504648568241 | 0.21 | 0.472 | -0.665 | 0.879 |
| 87.67199702491634 | 0.218 | 0.466 | -0.667 | 0.877 |
| 87.83004834510972 | 0.227 | 0.458 | -0.668 | 0.876 |
| 87.99739680178506 | 0.232 | 0.452 | -0.67 | 0.876 |
| 88.1647452584604 | 0.237 | 0.445 | -0.671 | 0.875 |
| 88.33209371513574 | 0.24 | 0.441 | -0.674 | 0.875 |
| 88.49944217181108 | 0.241 | 0.437 | -0.674 | 0.875 |
| 88.66679062848644 | 0.243 | 0.436 | -0.675 | 0.875 |
| 88.83413908516178 | 0.243 | 0.434 | -0.676 | 0.875 |
| 89.00148754183712 | 0.239 | 0.431 | -0.676 | 0.874 |
| 89.16883599851246 | 0.236 | 0.428 | -0.676 | 0.872 |
| 89.33618445518782 | 0.234 | 0.427 | -0.677 | 0.871 |
| 89.50353291186315 | 0.232 | 0.428 | -0.679 | 0.871 |
| 89.6708813685385 | 0.231 | 0.428 | -0.679 | 0.871 |
| 89.83822982521386 | 0.231 | 0.428 | -0.679 | 0.871 |
| 90.00557828188919 | 0.231 | 0.426 | -0.679 | 0.87 |
| 90.16362960208257 | 0.232 | 0.414 | -0.675 | 0.861 |
| 90.3309780587579 | 0.235 | 0.408 | -0.672 | 0.857 |
| 90.49832651543326 | 0.236 | 0.41 | -0.671 | 0.857 |
| 90.66567497210859 | 0.237 | 0.413 | -0.67 | 0.858 |
| 90.83302342878395 | 0.24 | 0.414 | -0.668 | 0.857 |
| 91.00037188545929 | 0.243 | 0.417 | -0.667 | 0.858 |
| 91.16772034213463 | 0.245 | 0.423 | -0.667 | 0.859 |
| 91.33506879880998 | 0.249 | 0.432 | -0.667 | 0.865 |
| 91.50241725548533 | 0.25 | 0.437 | -0.666 | 0.867 |
| 91.66976571216065 | 0.25 | 0.441 | -0.666 | 0.868 |
| 91.83711416883601 | 0.253 | 0.446 | -0.666 | 0.872 |
| 92.00446262551137 | 0.257 | 0.452 | -0.666 | 0.875 |
| 92.1718110821867 | 0.261 | 0.457 | -0.666 | 0.879 |
| 92.33915953886203 | 0.265 | 0.459 | -0.665 | 0.881 |
| 92.49721085905541 | 0.27 | 0.462 | -0.663 | 0.884 |
| 92.66455931573077 | 0.276 | 0.463 | -0.662 | 0.886 |
| 92.83190777240611 | 0.283 | 0.463 | -0.659 | 0.888 |
| 92.99925622908145 | 0.288 | 0.463 | -0.658 | 0.889 |
| 93.1666046857568 | 0.29 | 0.463 | -0.658 | 0.889 |
| 93.33395314243214 | 0.294 | 0.465 | -0.658 | 0.89 |
| 93.50130159910749 | 0.297 | 0.465 | -0.658 | 0.892 |
| 93.66865005578283 | 0.298 | 0.465 | -0.658 | 0.892 |
| 93.83599851245818 | 0.299 | 0.465 | -0.657 | 0.892 |
| 94.00334696913353 | 0.307 | 0.463 | -0.655 | 0.892 |
| 94.17069542580886 | 0.319 | 0.463 | -0.653 | 0.894 |
| 94.3380438824842 | 0.324 | 0.465 | -0.652 | 0.895 |
| 94.50539233915954 | 0.332 | 0.465 | -0.648 | 0.897 |
| 94.66344365935292 | 0.341 | 0.465 | -0.643 | 0.897 |
| 94.83079211602828 | 0.348 | 0.465 | -0.639 | 0.897 |
| 94.99814057270362 | 0.357 | 0.466 | -0.635 | 0.899 |
| 95.16548902937897 | 0.363 | 0.468 | -0.635 | 0.902 |
| 95.33283748605432 | 0.365 | 0.47 | -0.635 | 0.902 |
| 95.50018594272963 | 0.373 | 0.472 | -0.632 | 0.906 |
| 95.66753439940499 | 0.378 | 0.475 | -0.632 | 0.907 |
| 95.83488285608034 | 0.385 | 0.475 | -0.628 | 0.908 |
| 96.00223131275567 | 0.395 | 0.475 | -0.622 | 0.911 |
| 96.16957976943102 | 0.404 | 0.476 | -0.618 | 0.915 |
| 96.33692822610638 | 0.412 | 0.477 | -0.614 | 0.917 |
| 96.50427668278171 | 0.422 | 0.476 | -0.61 | 0.92 |
| 96.67162513945706 | 0.431 | 0.476 | -0.609 | 0.925 |
| 96.8389735961324 | 0.439 | 0.479 | -0.608 | 0.929 |
| 96.99702491632577 | 0.444 | 0.48 | -0.605 | 0.932 |
| 97.16437337300111 | 0.448 | 0.48 | -0.601 | 0.933 |
| 97.33172182967647 | 0.452 | 0.48 | -0.599 | 0.933 |
| 97.49907028635181 | 0.455 | 0.479 | -0.595 | 0.933 |
| 97.66641874302715 | 0.461 | 0.479 | -0.591 | 0.934 |
| 97.8337671997025 | 0.466 | 0.48 | -0.588 | 0.937 |
| 98.00111565637785 | 0.471 | 0.479 | -0.586 | 0.938 |
| 98.16846411305319 | 0.475 | 0.477 | -0.583 | 0.939 |
| 98.33581256972855 | 0.48 | 0.48 | -0.582 | 0.942 |
| 98.50316102640389 | 0.484 | 0.484 | -0.581 | 0.945 |
| 98.67050948307921 | 0.485 | 0.484 | -0.578 | 0.945 |
| 98.83785793975456 | 0.485 | 0.483 | -0.574 | 0.942 |
| 99.0052063964299 | 0.486 | 0.481 | -0.572 | 0.939 |
| 99.17255485310525 | 0.49 | 0.481 | -0.569 | 0.941 |
| 99.33060617329863 | 0.494 | 0.485 | -0.568 | 0.945 |
| 99.49795462997399 | 0.498 | 0.489 | -0.565 | 0.946 |
| 99.66530308664933 | 0.501 | 0.49 | -0.563 | 0.947 |
| 99.83265154332467 | 0.501 | 0.49 | -0.56 | 0.945 |
| 100.0 | 0.499 | 0.489 | -0.556 | 0.941 |